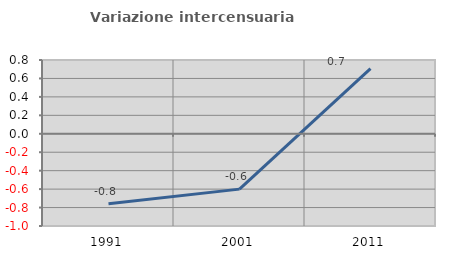
| Category | Variazione intercensuaria annua |
|---|---|
| 1991.0 | -0.758 |
| 2001.0 | -0.6 |
| 2011.0 | 0.707 |